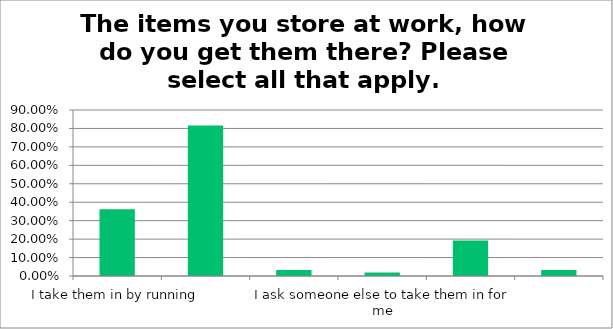
| Category | Responses |
|---|---|
| I take them in by running | 0.362 |
| I take them in when commuting by another mode of transport | 0.816 |
| I make additional trips to take them in | 0.033 |
| I ask someone else to take them in for me | 0.018 |
| I acquire then locally to my workplace | 0.192 |
| Other (please specify) | 0.033 |